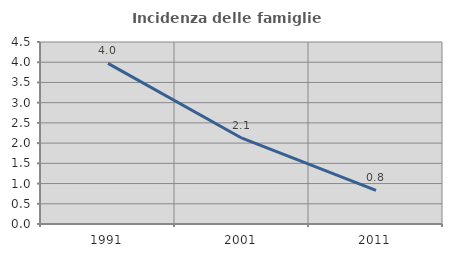
| Category | Incidenza delle famiglie numerose |
|---|---|
| 1991.0 | 3.972 |
| 2001.0 | 2.121 |
| 2011.0 | 0.832 |